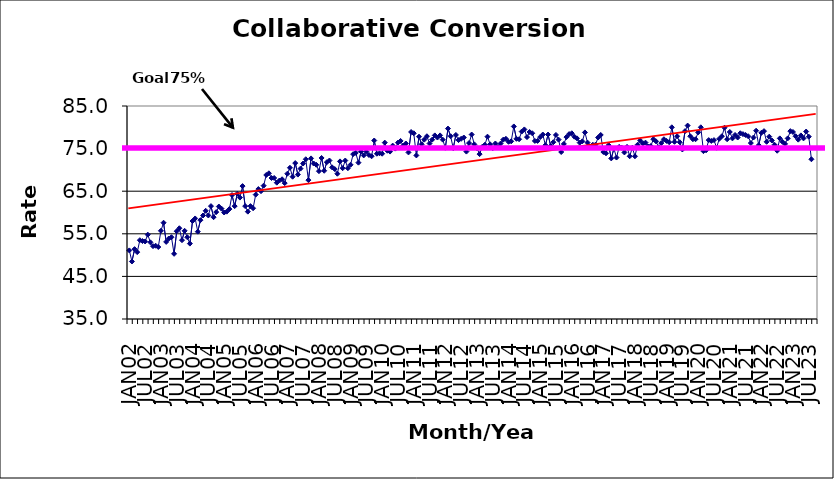
| Category | Series 0 |
|---|---|
| JAN02 | 51.1 |
| FEB02 | 48.5 |
| MAR02 | 51.4 |
| APR02 | 50.7 |
| MAY02 | 53.5 |
| JUN02 | 53.3 |
| JUL02 | 53.2 |
| AUG02 | 54.8 |
| SEP02 | 53 |
| OCT02 | 52.1 |
| NOV02 | 52.2 |
| DEC02 | 51.9 |
| JAN03 | 55.7 |
| FEB03 | 57.6 |
| MAR03 | 53.1 |
| APR03 | 53.9 |
| MAY03 | 54.2 |
| JUN03 | 50.3 |
| JUL03 | 55.6 |
| AUG03 | 56.3 |
| SEP03 | 53.5 |
| OCT03 | 55.7 |
| NOV03 | 54.2 |
| DEC03 | 52.7 |
| JAN04 | 58 |
| FEB04 | 58.6 |
| MAR04 | 55.5 |
| APR04 | 58.2 |
| MAY04 | 59.3 |
| JUN04 | 60.4 |
| JUL04 | 59.3 |
| AUG04 | 61.5 |
| SEP04 | 58.9 |
| OCT04 | 60.1 |
| NOV04 | 61.4 |
| DEC04 | 60.9 |
| JAN05 | 60 |
| FEB05 | 60.2 |
| MAR05 | 60.8 |
| APR05 | 64.1 |
| MAY05 | 61.5 |
| JUN05 | 64.4 |
| JUL05 | 63.5 |
| AUG05 | 66.2 |
| SEP05 | 61.5 |
| OCT05 | 60.2 |
| NOV05 | 61.5 |
| DEC05 | 61 |
| JAN06 | 64.2 |
| FEB06 | 65.5 |
| MAR06 | 65 |
| APR06 | 66.3 |
| MAY06 | 68.8 |
| JUN06 | 69.2 |
| JUL06 | 68.1 |
| AUG06 | 68.1 |
| SEP06 | 67 |
| OCT06 | 67.5 |
| NOV06 | 67.8 |
| DEC06 | 66.9 |
| JAN07 | 69.1 |
| FEB07 | 70.5 |
| MAR07 | 68.4 |
| APR07 | 71.6 |
| MAY07 | 68.9 |
| JUN07 | 70.3 |
| JUL07 | 71.5 |
| AUG07 | 72.5 |
| SEP07 | 67.6 |
| OCT07 | 72.7 |
| NOV07 | 71.5 |
| DEC07 | 71.2 |
| JAN08 | 69.7 |
| FEB08 | 72.8 |
| MAR08 | 69.8 |
| APR08 | 71.8 |
| MAY08 | 72.2 |
| JUN08 | 70.6 |
| JUL08 | 70.2 |
| AUG08 | 69.1 |
| SEP08 | 72 |
| OCT08 | 70.4 |
| NOV08 | 72.2 |
| DEC08 | 70.4 |
| JAN09 | 71.2 |
| FEB09 | 73.7 |
| MAR09 | 74 |
| APR09 | 71.7 |
| MAY09 | 74.3 |
| JUN09 | 73.4 |
| JUL09 | 74.3 |
| AUG09 | 73.5 |
| SEP09 | 73.2 |
| OCT09 | 76.9 |
| NOV09 | 73.8 |
| DEC09 | 73.9 |
| JAN10 | 73.8 |
| FEB10 | 76.4 |
| MAR10 | 74.5 |
| APR10 | 74.3 |
| MAY10 | 75.7 |
| JUN10 | 75 |
| JUL10 | 76.4 |
| AUG10 | 76.8 |
| SEP10 | 75.7 |
| OCT10 | 76.2 |
| NOV10 | 74.1 |
| DEC10 | 78.9 |
| JAN11 | 78.6 |
| FEB11 | 73.4 |
| MAR11 | 77.8 |
| APR11 | 76 |
| MAY11 | 77.1 |
| JUN11 | 77.9 |
| JUL11 | 76.2 |
| AUG11 | 77.1 |
| SEP11 | 78.1 |
| OCT11 | 77.6 |
| NOV11 | 78.1 |
| DEC11 | 77.1 |
| JAN12 | 75.2 |
| FEB12 | 79.7 |
| MAR12 | 77.9 |
| APR12 | 75.1 |
| MAY12 | 78.2 |
| JUN12 | 77 |
| JUL12 | 77.3 |
| AUG12 | 77.6 |
| SEP12 | 74.3 |
| OCT12 | 76.3 |
| NOV12 | 78.3 |
| DEC12 | 76 |
| JAN13 | 75.1 |
| FEB13 | 73.7 |
| MAR13 | 75.4 |
| APR13 | 75.9 |
| MAY13 | 77.8 |
| JUN13 | 76 |
| JUL13 | 75.1 |
| AUG13 | 76.2 |
| SEP13 | 75.4 |
| OCT13 | 76.2 |
| NOV13 | 77.1 |
| DEC13 | 77.3 |
| JAN14 | 76.6 |
| FEB14 | 76.7 |
| MAR14 | 80.2 |
| APR14 | 77.3 |
| MAY14 | 77.2 |
| JUN14 | 79 |
| JUL14 | 79.5 |
| AUG14 | 77.7 |
| SEP14 | 78.9 |
| OCT14 | 78.6 |
| NOV14 | 76.8 |
| DEC14 | 76.8 |
| JAN15 | 77.7 |
| FEB15 | 78.3 |
| MAR15 | 75.8 |
| APR15 | 78.3 |
| MAY15 | 75.6 |
| JUN15 | 76.5 |
| JUL15 | 78.2 |
| AUG15 | 77.1 |
| SEP15 | 74.2 |
| OCT15 | 76.1 |
| NOV15 | 77.7 |
| DEC15 | 78.4 |
| JAN16 | 78.6 |
| FEB16 | 77.8 |
| MAR16 | 77.4 |
| APR16 | 76.4 |
| MAY16 | 76.7 |
| JUN16 | 78.8 |
| JUL16 | 76.4 |
| AUG16 | 75.5 |
| SEP16 | 75.9 |
| OCT16 | 75.9 |
| NOV16 | 77.6 |
| DEC16 | 78.2 |
| JAN17 | 74.2 |
| FEB17 | 73.9 |
| MAR17 | 75.8 |
| APR17 | 72.7 |
| MAY17 | 75 |
| JUN17 | 72.9 |
| JUL17 | 75.4 |
| AUG17 | 75.2 |
| SEP17 | 74.1 |
| OCT17 | 75.4 |
| NOV17 | 73.2 |
| DEC17 | 75.2 |
| JAN18 | 73.2 |
| FEB18 | 75.9 |
| MAR18 | 76.9 |
| APR18 | 76.2 |
| MAY18 | 76.4 |
| JUN18 | 75.5 |
| JUL18 | 75.6 |
| AUG18 | 77.2 |
| SEP18 | 76.7 |
| OCT18 | 75.3 |
| NOV18 | 76.3 |
| DEC18 | 77.2 |
| JAN19 | 76.8 |
| FEB19 | 76.5 |
| MAR19 | 80 |
| APR19 | 76.6 |
| MAY19 | 77.9 |
| JUN19 | 76.5 |
| JUL19 | 74.8 |
| AUG19 | 79.1 |
| SEP19 | 80.4 |
| OCT19 | 77.9 |
| NOV19 | 77.2 |
| DEC19 | 77.2 |
| JAN20 | 78.8 |
| FEB20 | 80 |
| MAR20 | 74.4 |
| APR20 | 74.6 |
| MAY20 | 77 |
| JUN20 | 76.8 |
| JUL20 | 77 |
| AUG20 | 75.2 |
| SEP20 | 77.3 |
| OCT20 | 77.9 |
| NOV20 | 79.9 |
| DEC20 | 77.2 |
| JAN21 | 78.9 |
| FEB21 | 77.4 |
| MAR21 | 78.2 |
| APR21 | 77.6 |
| MAY21 | 78.6 |
| JUN21 | 78.4 |
| JUL21 | 78.2 |
| AUG21 | 77.9 |
| SEP21 | 76.3 |
| OCT21 | 77.6 |
| NOV21 | 79.2 |
| DEC21 | 75.8 |
| JAN22 | 78.7 |
| FEB22 | 79.1 |
| MAR22 | 76.6 |
| APR22 | 77.8 |
| MAY22 | 76.9 |
| JUN22 | 75.9 |
| JUL22 | 74.5 |
| AUG22 | 77.4 |
| SEP22 | 76.6 |
| OCT22 | 76.1 |
| NOV22 | 77.4 |
| DEC22 | 79.1 |
| JAN23 | 78.9 |
| FEB23 | 77.9 |
| MAR23 | 77.1 |
| APR23 | 78.1 |
| MAY23 | 77.4 |
| JUN23 | 79 |
| JUL23 | 77.8 |
| AUG23 | 72.5 |